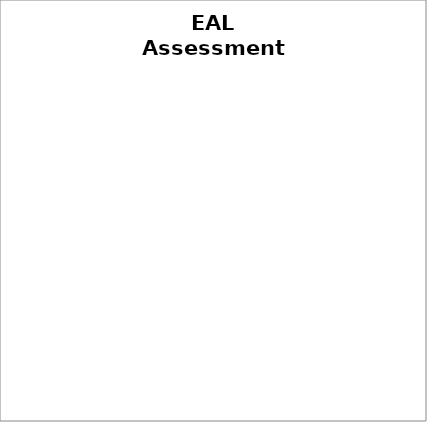
| Category | Series 0 |
|---|---|
| Stage 1 | 0 |
| Stage 2 | 0 |
| Stage 3 | 0 |
| Stage 4 | 0 |
| Stage 5 | 0 |
| Stage 6 | 0 |
| Stage 7 | 0 |
| Stage 8 | 0 |